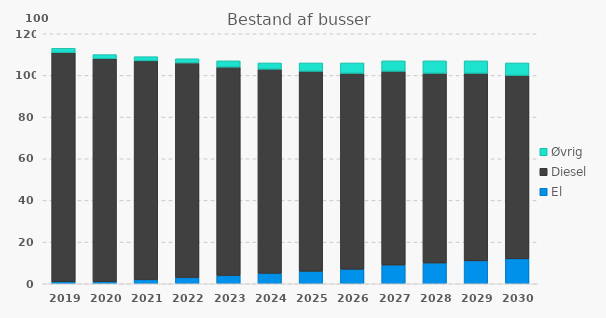
| Category | El | Diesel | Øvrig |
|---|---|---|---|
| 2019 | 1 | 110 | 2 |
| 2020 | 1 | 107 | 2 |
| 2021 | 2 | 105 | 2 |
| 2022 | 3 | 103 | 2 |
| 2023 | 4 | 100 | 3 |
| 2024 | 5 | 98 | 3 |
| 2025 | 6 | 96 | 4 |
| 2026 | 7 | 94 | 5 |
| 2027 | 9 | 93 | 5 |
| 2028 | 10 | 91 | 6 |
| 2029 | 11 | 90 | 6 |
| 2030 | 12 | 88 | 6 |